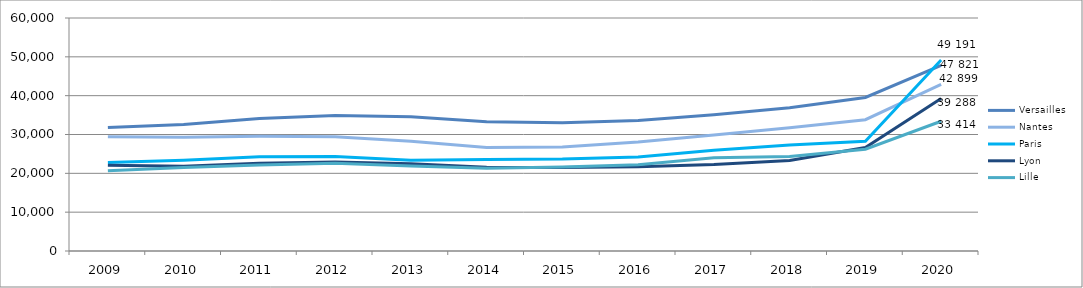
| Category | Versailles | Nantes | Paris | Lyon | Lille |
|---|---|---|---|---|---|
| 2009.0 | 31823 | 29441 | 22765 | 22100 | 20668 |
| 2010.0 | 32576 | 29319 | 23342 | 21838 | 21488 |
| 2011.0 | 34123 | 29543 | 24282 | 22594 | 22126 |
| 2012.0 | 34905 | 29435 | 24351 | 22908 | 22589 |
| 2013.0 | 34553 | 28286 | 23391 | 22436 | 21871 |
| 2014.0 | 33299 | 26670 | 23566 | 21593 | 21289 |
| 2015.0 | 33004 | 26800 | 23659 | 21522 | 21627 |
| 2016.0 | 33632 | 28075 | 24228 | 21665 | 22241 |
| 2017.0 | 35086 | 29893 | 25956 | 22265 | 24012 |
| 2018.0 | 36875 | 31743 | 27267 | 23304 | 24307 |
| 2019.0 | 39529 | 33813 | 28269 | 26646 | 26215 |
| 2020.0 | 47821 | 42899 | 49191 | 39288 | 33414 |